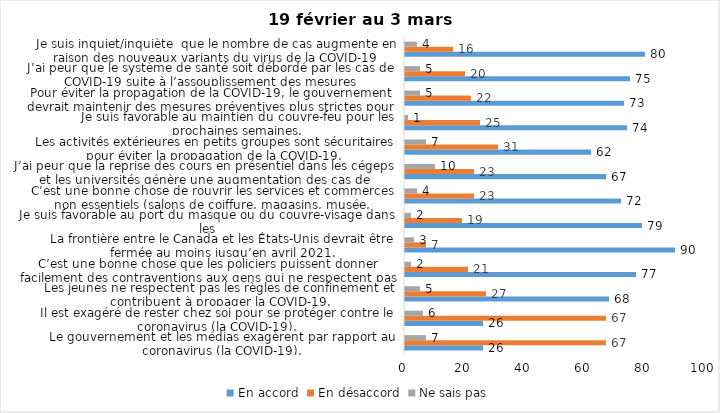
| Category | En accord | En désaccord | Ne sais pas |
|---|---|---|---|
| Le gouvernement et les médias exagèrent par rapport au coronavirus (la COVID-19). | 26 | 67 | 7 |
| Il est exagéré de rester chez soi pour se protéger contre le coronavirus (la COVID-19). | 26 | 67 | 6 |
| Les jeunes ne respectent pas les règles de confinement et contribuent à propager la COVID-19. | 68 | 27 | 5 |
| C’est une bonne chose que les policiers puissent donner facilement des contraventions aux gens qui ne respectent pas les mesures pour prévenir le coronavirus (la COVID-19). | 77 | 21 | 2 |
| La frontière entre le Canada et les États-Unis devrait être fermée au moins jusqu’en avril 2021. | 90 | 7 | 3 |
| Je suis favorable au port du masque ou du couvre-visage dans les
lieux publics extérieurs achalandés (ex. rues, parcs) | 79 | 19 | 2 |
| C’est une bonne chose de rouvrir les services et commerces non essentiels (salons de coiffure, magasins, musée, industries) à partir du 8 février 2021. | 72 | 23 | 4 |
| J’ai peur que la reprise des cours en présentiel dans les cégeps et les universités génère une augmentation des cas de COVID-19. | 67 | 23 | 10 |
| Les activités extérieures en petits groupes sont sécuritaires pour éviter la propagation de la COVID-19. | 62 | 31 | 7 |
| Je suis favorable au maintien du couvre-feu pour les prochaines semaines. | 74 | 25 | 1 |
| Pour éviter la propagation de la COVID-19, le gouvernement devrait maintenir des mesures préventives plus strictes pour la grande région de Montréal. | 73 | 22 | 5 |
| J’ai peur que le système de santé soit débordé par les cas de COVID-19 suite à l’assouplissement des mesures | 75 | 20 | 5 |
| Je suis inquiet/inquiète  que le nombre de cas augmente en raison des nouveaux variants du virus de la COVID-19 | 80 | 16 | 4 |